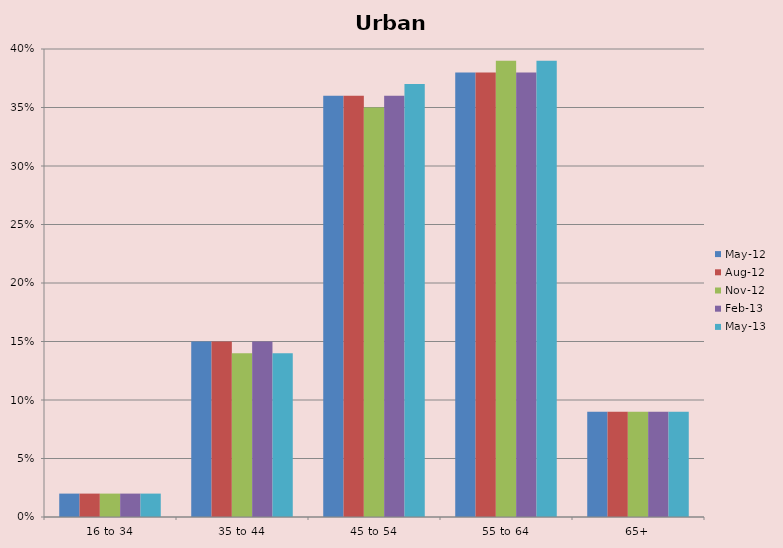
| Category | May-12 | Aug-12 | Nov-12 | Feb-13 | May-13 |
|---|---|---|---|---|---|
| 16 to 34 | 0.02 | 0.02 | 0.02 | 0.02 | 0.02 |
| 35 to 44 | 0.15 | 0.15 | 0.14 | 0.15 | 0.14 |
| 45 to 54 | 0.36 | 0.36 | 0.35 | 0.36 | 0.37 |
| 55 to 64 | 0.38 | 0.38 | 0.39 | 0.38 | 0.39 |
| 65+ | 0.09 | 0.09 | 0.09 | 0.09 | 0.09 |